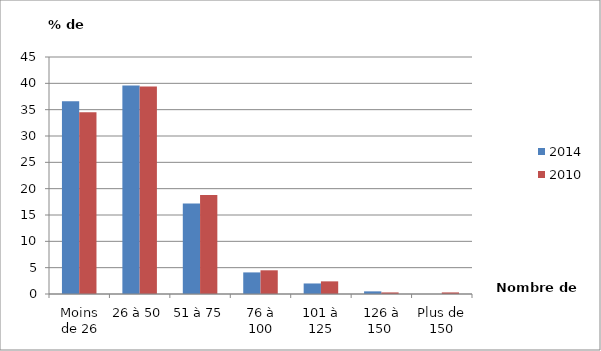
| Category | 2014 | 2010 |
|---|---|---|
| Moins de 26 | 36.6 | 34.5 |
| 26 à 50 | 39.6 | 39.4 |
| 51 à 75 | 17.2 | 18.8 |
| 76 à 100 | 4.1 | 4.5 |
| 101 à 125 | 2 | 2.4 |
| 126 à 150  | 0.5 | 0.3 |
| Plus de 150 | 0 | 0.3 |